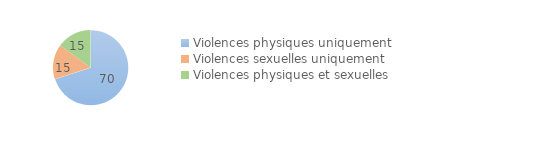
| Category | Series 0 |
|---|---|
| Violences physiques uniquement | 70 |
| Violences sexuelles uniquement | 15 |
| Violences physiques et sexuelles | 15 |